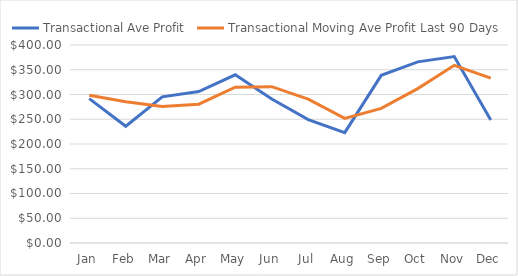
| Category | Transactional Ave Profit | Transactional Moving Ave Profit Last 90 Days |
|---|---|---|
| Jan | 291.594 | 298.346 |
| Feb | 235.805 | 285.43 |
| Mar | 295.342 | 275.668 |
| Apr | 305.953 | 280.444 |
| May | 339.858 | 314.822 |
| Jun | 290.975 | 315.888 |
| Jul | 249.316 | 290.493 |
| Aug | 223.094 | 251.811 |
| Sep | 338.74 | 271.84 |
| Oct | 365.932 | 311.955 |
| Nov | 376.595 | 358.97 |
| Dec | 248.506 | 332.918 |